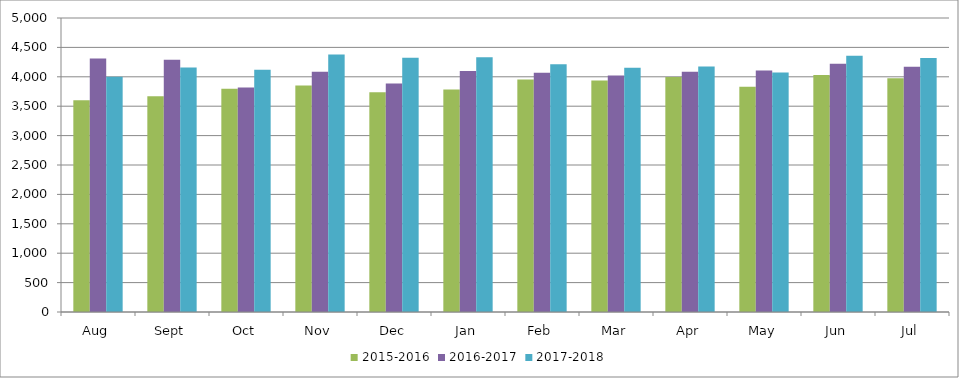
| Category | 2015-2016 | 2016-2017 | 2017-2018 |
|---|---|---|---|
| Aug | 3600 | 4313 | 4001 |
| Sept | 3671 | 4288 | 4159 |
| Oct | 3798 | 3818 | 4118 |
| Nov | 3850 | 4088 | 4378 |
| Dec | 3736 | 3884 | 4323 |
| Jan | 3786 | 4097 | 4332 |
| Feb | 3956 | 4070 | 4213 |
| Mar | 3939 | 4023 | 4152 |
| Apr | 3995 | 4084 | 4176 |
| May | 3829 | 4108 | 4075 |
| Jun | 4029 | 4222 | 4360 |
| Jul | 3975 | 4173 | 4320 |